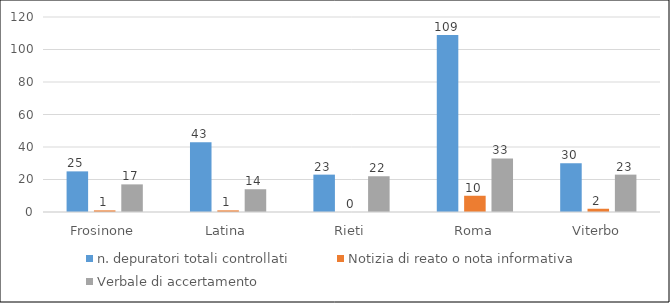
| Category | n. depuratori totali controllati | Notizia di reato o nota informativa | Verbale di accertamento |
|---|---|---|---|
| Frosinone | 25 | 1 | 17 |
| Latina | 43 | 1 | 14 |
| Rieti | 23 | 0 | 22 |
| Roma | 109 | 10 | 33 |
| Viterbo | 30 | 2 | 23 |